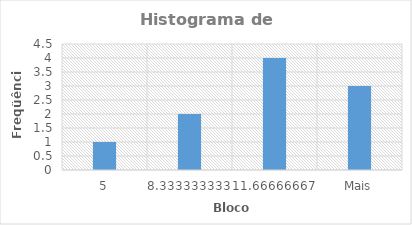
| Category | Freqüência |
|---|---|
| 5 | 1 |
| 8,333333333 | 2 |
| 11,66666667 | 4 |
| Mais | 3 |